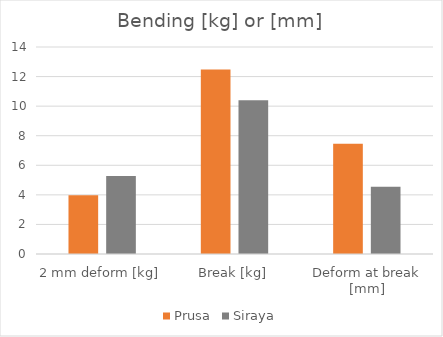
| Category | Prusa | Siraya |
|---|---|---|
| 2 mm deform [kg] | 3.975 | 5.275 |
| Break [kg] | 12.475 | 10.4 |
| Deform at break [mm] | 7.45 | 4.545 |